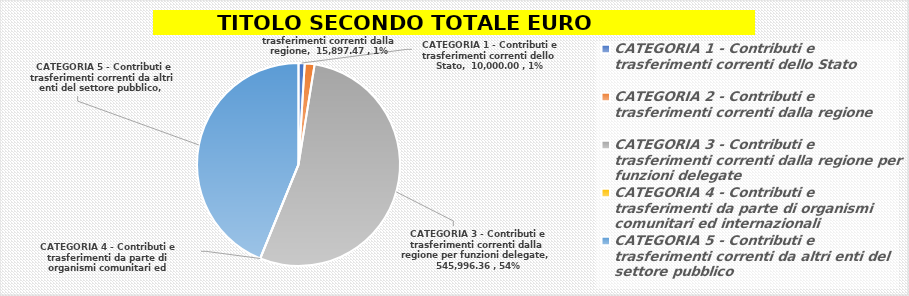
| Category | Series 0 |
|---|---|
| CATEGORIA 1 - Contributi e trasferimenti correnti dello Stato | 10000 |
| CATEGORIA 2 - Contributi e trasferimenti correnti dalla regione | 15897.47 |
| CATEGORIA 3 - Contributi e trasferimenti correnti dalla regione per funzioni delegate | 545996.36 |
| CATEGORIA 4 - Contributi e trasferimenti da parte di organismi comunitari ed internazionali | 0 |
| CATEGORIA 5 - Contributi e trasferimenti correnti da altri enti del settore pubblico | 446503.48 |